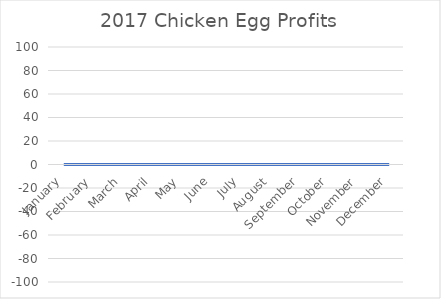
| Category | Series 0 |
|---|---|
| January | 0 |
| February | 0 |
| March | 0 |
| April | 0 |
| May | 0 |
| June | 0 |
| July | 0 |
| August | 0 |
| September | 0 |
| October | 0 |
| November | 0 |
| December | 0 |